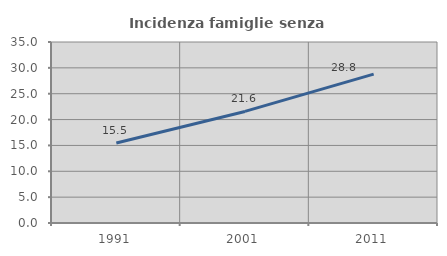
| Category | Incidenza famiglie senza nuclei |
|---|---|
| 1991.0 | 15.481 |
| 2001.0 | 21.576 |
| 2011.0 | 28.799 |